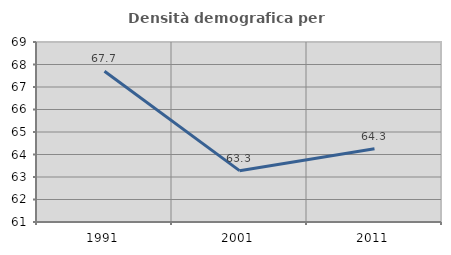
| Category | Densità demografica |
|---|---|
| 1991.0 | 67.703 |
| 2001.0 | 63.282 |
| 2011.0 | 64.259 |